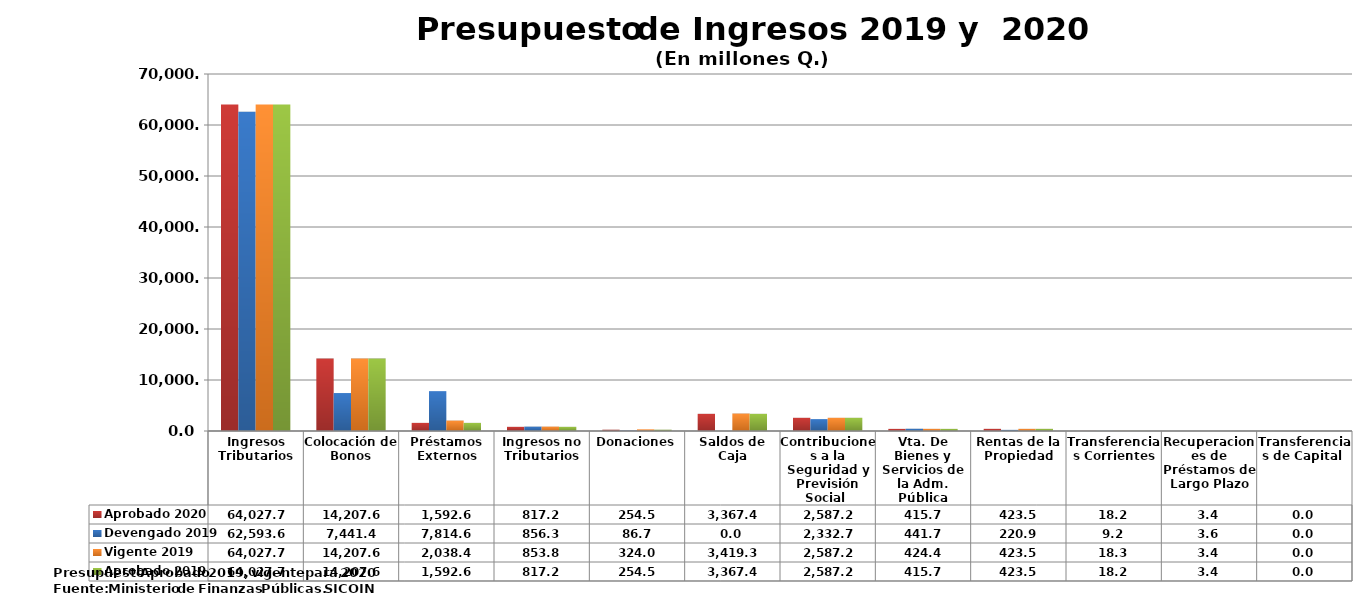
| Category | Aprobado 2020 | Devengado 2019 | Vigente 2019 | Aprobado 2019 |
|---|---|---|---|---|
| Ingresos Tributarios | 64027.7 | 62593.6 | 64027.7 | 64027.7 |
| Colocación de Bonos | 14207.6 | 7441.4 | 14207.6 | 14207.6 |
| Préstamos Externos | 1592.6 | 7814.6 | 2038.4 | 1592.6 |
| Ingresos no Tributarios | 817.2 | 856.3 | 853.8 | 817.2 |
| Donaciones | 254.5 | 86.7 | 324 | 254.5 |
| Saldos de Caja | 3367.4 | 0 | 3419.3 | 3367.4 |
| Contribuciones a la Seguridad y Previsión Social  | 2587.2 | 2332.7 | 2587.2 | 2587.2 |
| Vta. De Bienes y Servicios de la Adm. Pública | 415.7 | 441.7 | 424.4 | 415.7 |
| Rentas de la Propiedad | 423.5 | 220.9 | 423.5 | 423.5 |
| Transferencias Corrientes | 18.2 | 9.2 | 18.3 | 18.2 |
| Recuperaciones de Préstamos de Largo Plazo | 3.4 | 3.6 | 3.4 | 3.4 |
| Transferencias de Capital  | 0 | 0 | 0 | 0 |